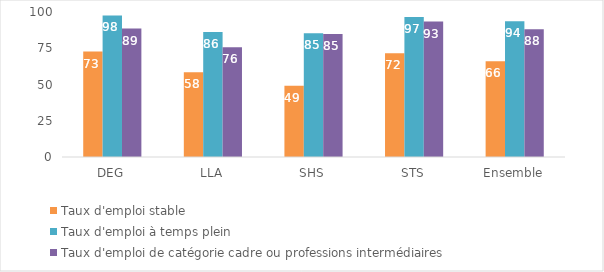
| Category | Taux d'emploi stable | Taux d'emploi à temps plein | Taux d'emploi de catégorie cadre ou professions intermédiaires |
|---|---|---|---|
| DEG | 72.73 | 97.6 | 88.55 |
| LLA | 58.39 | 86.15 | 75.7 |
| SHS | 49.06 | 85.28 | 84.91 |
| STS | 71.56 | 96.52 | 93.42 |
| Ensemble | 66.09 | 93.65 | 88.02 |